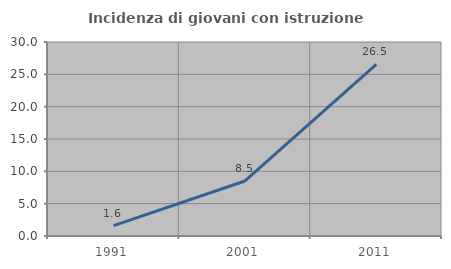
| Category | Incidenza di giovani con istruzione universitaria |
|---|---|
| 1991.0 | 1.613 |
| 2001.0 | 8.511 |
| 2011.0 | 26.531 |